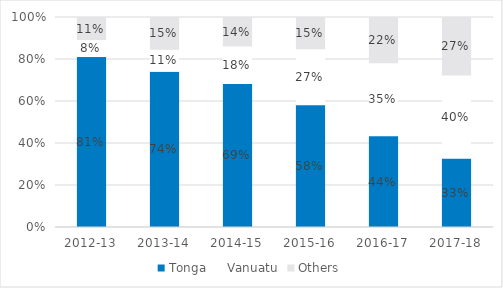
| Category | Tonga | Vanuatu | Others |
|---|---|---|---|
| 2012-13 | 0.814 | 0.081 | 0.105 |
| 2013-14 | 0.743 | 0.105 | 0.151 |
| 2014-15 | 0.686 | 0.178 | 0.136 |
| 2015-16 | 0.584 | 0.267 | 0.149 |
| 2016-17 | 0.436 | 0.349 | 0.215 |
| 2017-18 | 0.33 | 0.396 | 0.274 |